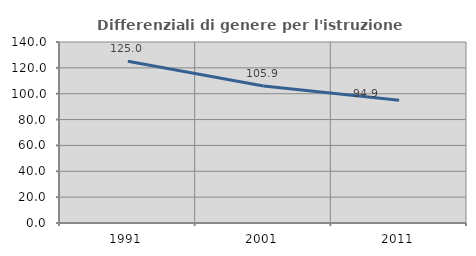
| Category | Differenziali di genere per l'istruzione superiore |
|---|---|
| 1991.0 | 125.038 |
| 2001.0 | 105.895 |
| 2011.0 | 94.86 |